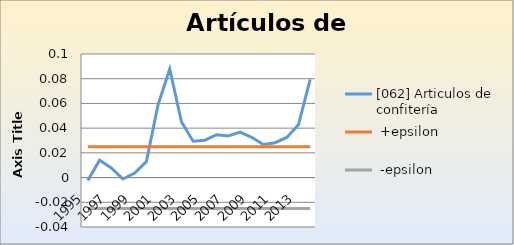
| Category | [062] Articulos de confitería  |  +epsilon |  -epsilon |
|---|---|---|---|
| 1995.0 | -0.002 | 0.025 | -0.025 |
| 1996.0 | 0.014 | 0.025 | -0.025 |
| 1997.0 | 0.008 | 0.025 | -0.025 |
| 1998.0 | -0.001 | 0.025 | -0.025 |
| 1999.0 | 0.004 | 0.025 | -0.025 |
| 2000.0 | 0.013 | 0.025 | -0.025 |
| 2001.0 | 0.059 | 0.025 | -0.025 |
| 2002.0 | 0.088 | 0.025 | -0.025 |
| 2003.0 | 0.045 | 0.025 | -0.025 |
| 2004.0 | 0.029 | 0.025 | -0.025 |
| 2005.0 | 0.03 | 0.025 | -0.025 |
| 2006.0 | 0.035 | 0.025 | -0.025 |
| 2007.0 | 0.034 | 0.025 | -0.025 |
| 2008.0 | 0.037 | 0.025 | -0.025 |
| 2009.0 | 0.033 | 0.025 | -0.025 |
| 2010.0 | 0.027 | 0.025 | -0.025 |
| 2011.0 | 0.028 | 0.025 | -0.025 |
| 2012.0 | 0.032 | 0.025 | -0.025 |
| 2013.0 | 0.043 | 0.025 | -0.025 |
| 2014.0 | 0.079 | 0.025 | -0.025 |